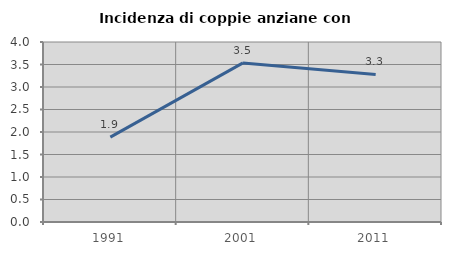
| Category | Incidenza di coppie anziane con figli |
|---|---|
| 1991.0 | 1.887 |
| 2001.0 | 3.535 |
| 2011.0 | 3.279 |